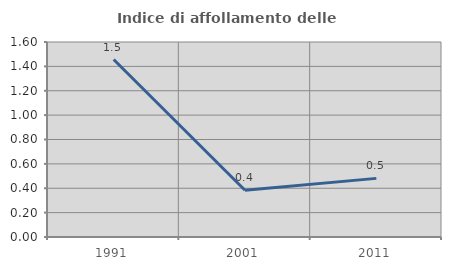
| Category | Indice di affollamento delle abitazioni  |
|---|---|
| 1991.0 | 1.456 |
| 2001.0 | 0.383 |
| 2011.0 | 0.481 |